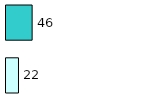
| Category | Series 0 | Series 1 |
|---|---|---|
| 0 | 22 | 46 |